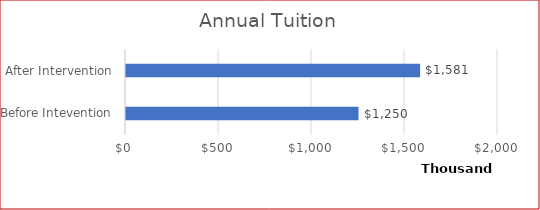
| Category | Annual Tuition |
|---|---|
| Before Intevention | 1250000 |
| After Intervention | 1581250 |